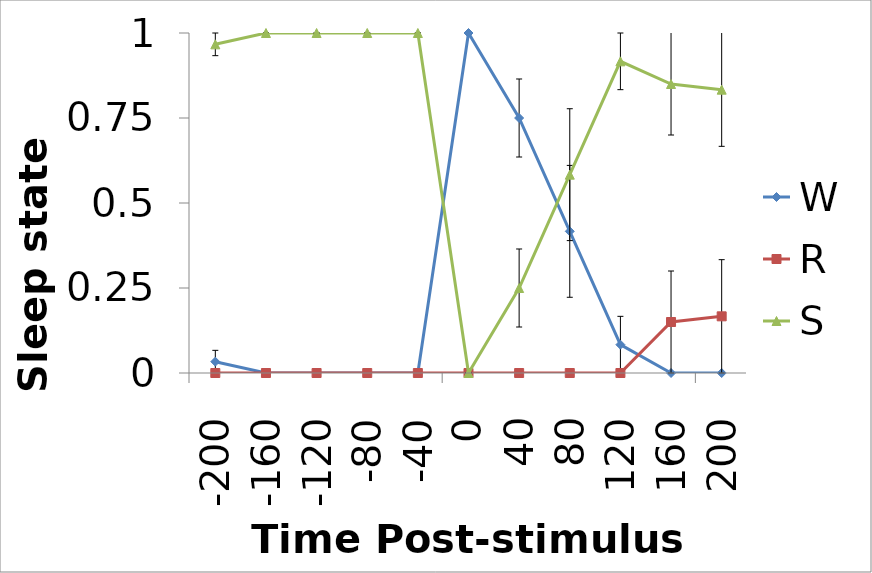
| Category | W | R | S |
|---|---|---|---|
| -200.0 | 0.033 | 0 | 0.967 |
| -160.0 | 0 | 0 | 1 |
| -120.0 | 0 | 0 | 1 |
| -80.0 | 0 | 0 | 1 |
| -40.0 | 0 | 0 | 1 |
| 0.0 | 1 | 0 | 0 |
| 40.0 | 0.75 | 0 | 0.25 |
| 80.0 | 0.417 | 0 | 0.583 |
| 120.0 | 0.083 | 0 | 0.917 |
| 160.0 | 0 | 0.15 | 0.85 |
| 200.0 | 0 | 0.167 | 0.833 |